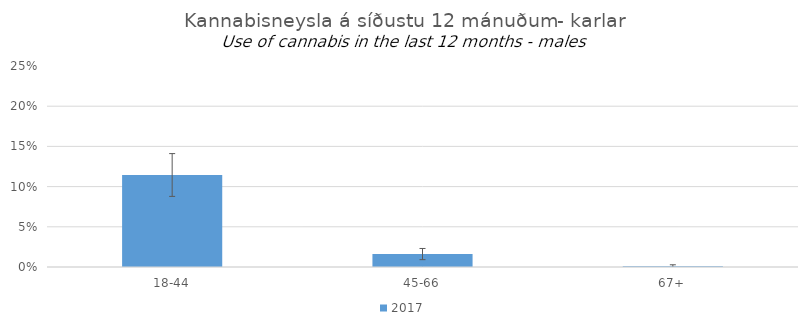
| Category | 2017 |
|---|---|
| 18-44 | 0.114 |
| 45-66 | 0.016 |
| 67+ | 0.001 |